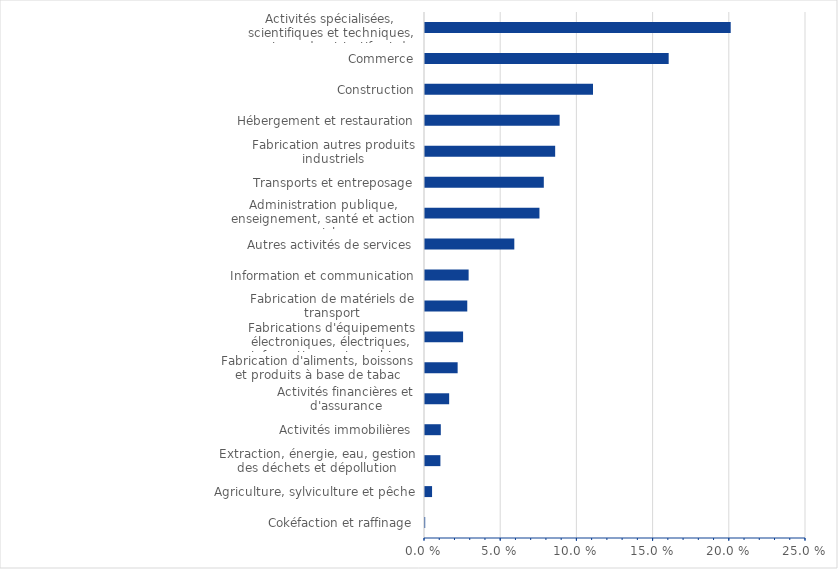
| Category | Series 0 |
|---|---|
| Cokéfaction et raffinage | 0 |
| Agriculture, sylviculture et pêche | 0.005 |
| Extraction, énergie, eau, gestion des déchets et dépollution | 0.01 |
| Activités immobilières | 0.01 |
| Activités financières et d'assurance | 0.016 |
| Fabrication d'aliments, boissons et produits à base de tabac | 0.021 |
| Fabrications d'équipements électroniques, électriques, informatiques et machines | 0.025 |
| Fabrication de matériels de transport | 0.028 |
| Information et communication | 0.029 |
| Autres activités de services | 0.059 |
| Administration publique, enseignement, santé et action sociale | 0.075 |
| Transports et entreposage | 0.078 |
| Fabrication autres produits industriels | 0.085 |
| Hébergement et restauration | 0.088 |
| Construction | 0.11 |
| Commerce | 0.16 |
| Activités spécialisées, scientifiques et techniques, services admnistratifs et de soutien | 0.201 |